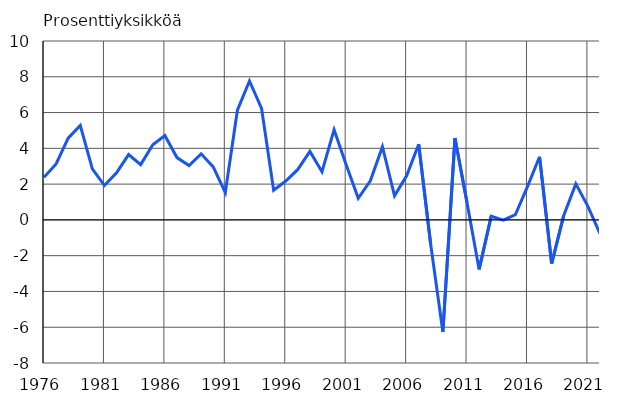
| Category | Prosenttiyksikköä |
|---|---|
| 1976 | 2.38 |
| 1977 | 3.128 |
| 1978 | 4.569 |
| 1979 | 5.285 |
| 1980 | 2.847 |
| 1981 | 1.921 |
| 1982 | 2.633 |
| 1983 | 3.651 |
| 1984 | 3.088 |
| 1985 | 4.202 |
| 1986 | 4.713 |
| 1987 | 3.483 |
| 1988 | 3.035 |
| 1989 | 3.694 |
| 1990 | 2.962 |
| 1991 | 1.528 |
| 1992 | 6.131 |
| 1993 | 7.767 |
| 1994 | 6.236 |
| 1995 | 1.659 |
| 1996 | 2.172 |
| 1997 | 2.82 |
| 1998 | 3.829 |
| 1999 | 2.695 |
| 2000 | 5.045 |
| 2001 | 3.083 |
| 2002 | 1.204 |
| 2003 | 2.185 |
| 2004 | 4.091 |
| 2005 | 1.342 |
| 2006 | 2.466 |
| 2007 | 4.228 |
| 2008 | -1.409 |
| 2009 | -6.268 |
| 2010 | 4.575 |
| 2011 | 0.962 |
| 2012 | -2.77 |
| 2013 | 0.202 |
| 2014 | -0.014 |
| 2015 | 0.291 |
| 2016 | 1.861 |
| 2017 | 3.527 |
| 2018 | -2.439 |
| 2019 | 0.252 |
| 2020 | 2.012 |
| 2021 | 0.758 |
| 2022* | -0.772 |